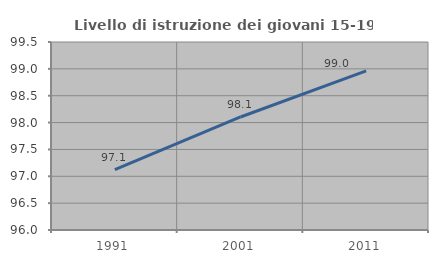
| Category | Livello di istruzione dei giovani 15-19 anni |
|---|---|
| 1991.0 | 97.124 |
| 2001.0 | 98.104 |
| 2011.0 | 98.961 |